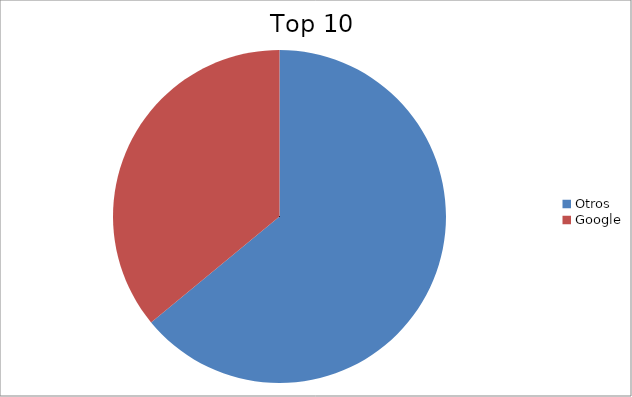
| Category | Series 0 |
|---|---|
| Otros | 64.02 |
| Google | 35.98 |